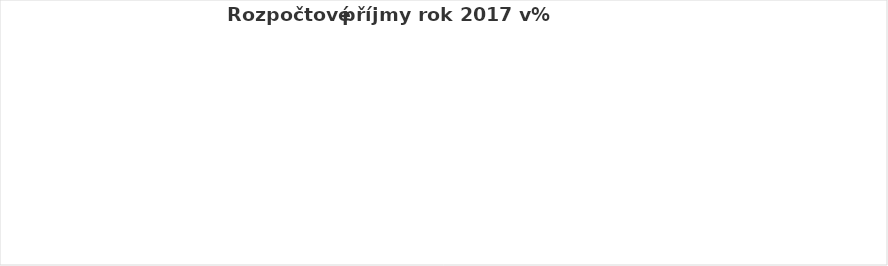
| Category | Series 0 |
|---|---|
| Daňové příjmy | 0 |
| Nedaňové příjmy  | 0 |
| Kapitálové příjmy | 0 |
| Přijaté transfery_Dotace | 0 |
| Financování | 0 |